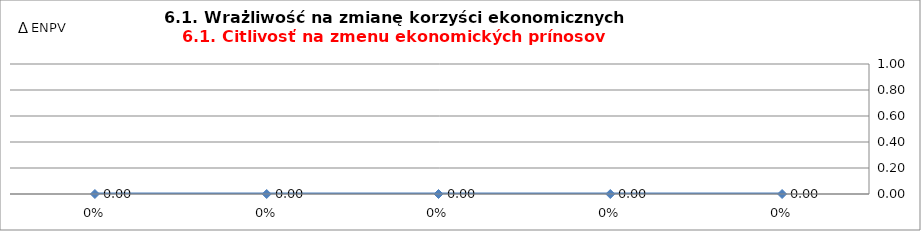
| Category | 6.1. Wrażliwość na zmianę korzyści ekonomicznych
6.1. Citlivosť na zmenu ekonomických prínosov |
|---|---|
| 0.0 | 0 |
| 0.0 | 0 |
| 0.0 | 0 |
| 0.0 | 0 |
| 0.0 | 0 |